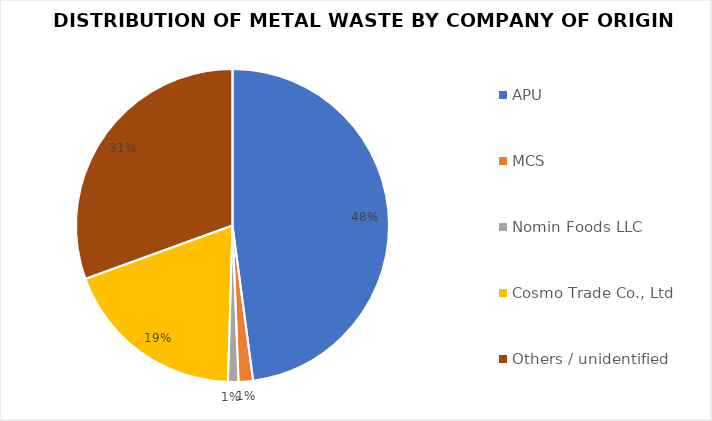
| Category | Series 0 |
|---|---|
| APU | 19.29 |
| MCS | 0.6 |
| Nomin Foods LLC | 0.435 |
| Cosmo Trade Co., Ltd | 7.65 |
| Others / unidentified | 12.3 |